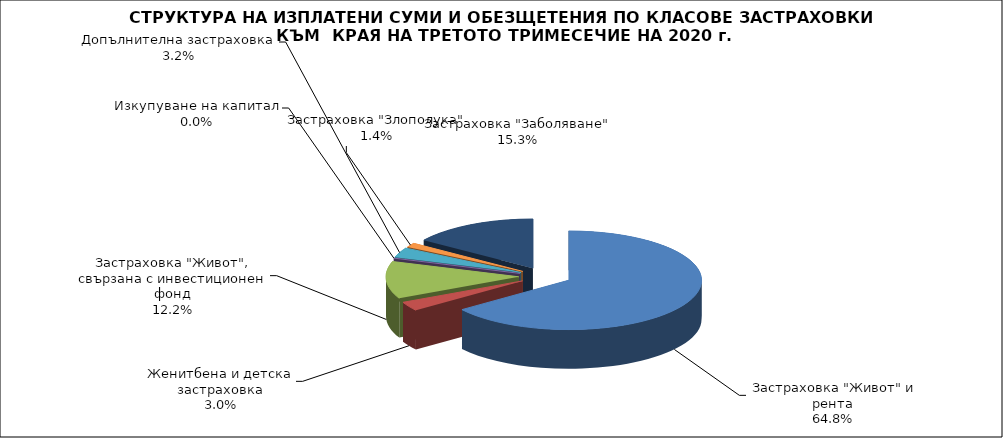
| Category | Series 0 |
|---|---|
|  Застраховка "Живот" и рента | 85521238.655 |
| Женитбена и детска застраховка | 3951457.246 |
| Застраховка "Живот", свързана с инвестиционен фонд | 16092037.99 |
| Изкупуване на капитал | 0 |
| Допълнителна застраховка | 4255264.813 |
| Застраховка "Злополука" | 1858174.194 |
| Застраховка "Заболяване" | 20225042.005 |